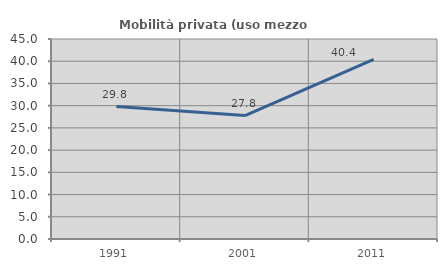
| Category | Mobilità privata (uso mezzo privato) |
|---|---|
| 1991.0 | 29.787 |
| 2001.0 | 27.778 |
| 2011.0 | 40.426 |